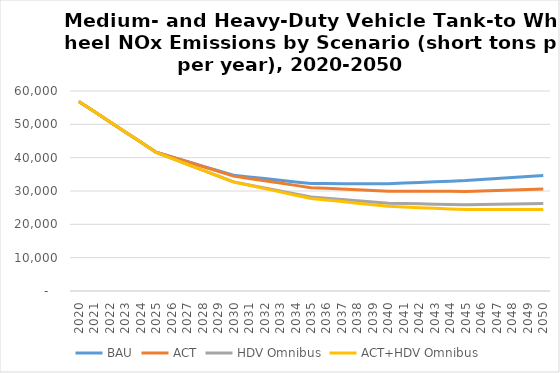
| Category | BAU | ACT | HDV Omnibus | ACT+HDV Omnibus |
|---|---|---|---|---|
| 2020.0 | 56870 | 56870 | 56870 | 56870 |
| 2021.0 | 53820 | 53820 | 53820 | 53820 |
| 2022.0 | 50770 | 50770 | 50770 | 50770 |
| 2023.0 | 47720 | 47720 | 47720 | 47720 |
| 2024.0 | 44670 | 44670 | 44670 | 44670 |
| 2025.0 | 41620 | 41620 | 41560 | 41560 |
| 2026.0 | 40240 | 40240 | 39790 | 39790 |
| 2027.0 | 38860 | 38800 | 38030 | 38020 |
| 2028.0 | 37480 | 37350 | 36260 | 36240 |
| 2029.0 | 36100 | 35910 | 34500 | 34470 |
| 2030.0 | 34720 | 34460 | 32730 | 32690 |
| 2031.0 | 34220 | 33770 | 31830 | 31710 |
| 2032.0 | 33720 | 33080 | 30920 | 30720 |
| 2033.0 | 33220 | 32380 | 30020 | 29740 |
| 2034.0 | 32720 | 31690 | 29110 | 28750 |
| 2035.0 | 32220 | 31000 | 28210 | 27770 |
| 2036.0 | 32220 | 30790 | 27830 | 27290 |
| 2037.0 | 32210 | 30570 | 27450 | 26820 |
| 2038.0 | 32210 | 30360 | 27080 | 26340 |
| 2039.0 | 32200 | 30140 | 26700 | 25870 |
| 2040.0 | 32200 | 29930 | 26320 | 25390 |
| 2041.0 | 32390 | 29920 | 26230 | 25200 |
| 2042.0 | 32580 | 29910 | 26140 | 25010 |
| 2043.0 | 32760 | 29900 | 26040 | 24820 |
| 2044.0 | 32950 | 29890 | 25950 | 24630 |
| 2045.0 | 33140 | 29880 | 25860 | 24440 |
| 2046.0 | 33450 | 30020 | 25940 | 24440 |
| 2047.0 | 33750 | 30170 | 26020 | 24440 |
| 2048.0 | 34060 | 30310 | 26110 | 24450 |
| 2049.0 | 34360 | 30460 | 26190 | 24450 |
| 2050.0 | 34670 | 30600 | 26270 | 24450 |